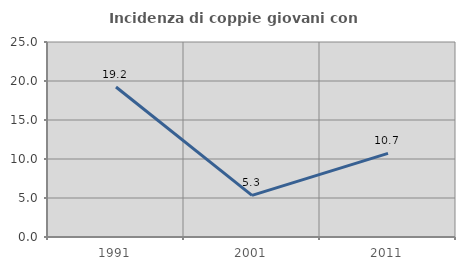
| Category | Incidenza di coppie giovani con figli |
|---|---|
| 1991.0 | 19.231 |
| 2001.0 | 5.333 |
| 2011.0 | 10.714 |